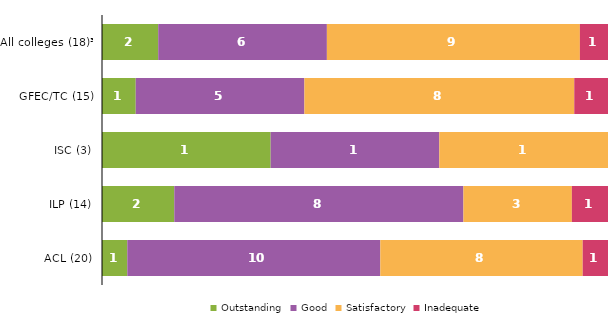
| Category | Outstanding | Good | Satisfactory | Inadequate |
|---|---|---|---|---|
| All colleges (18)³ | 2 | 6 | 9 | 1 |
| GFEC/TC (15) | 1 | 5 | 8 | 1 |
| ISC (3) | 1 | 1 | 1 | 0 |
| ILP (14) | 2 | 8 | 3 | 1 |
| ACL (20) | 1 | 10 | 8 | 1 |